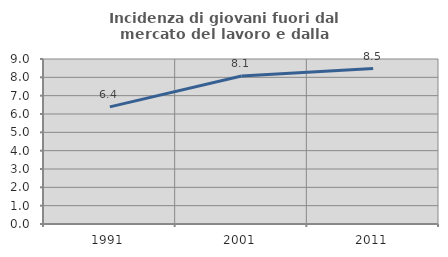
| Category | Incidenza di giovani fuori dal mercato del lavoro e dalla formazione  |
|---|---|
| 1991.0 | 6.389 |
| 2001.0 | 8.069 |
| 2011.0 | 8.48 |